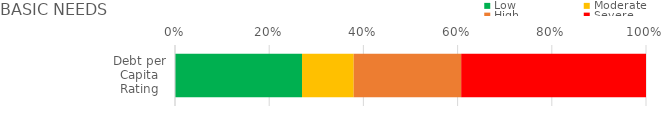
| Category | Low | Moderate | High | Severe |
|---|---|---|---|---|
| Debt per Capita Rating | 0.27 | 0.11 | 0.228 | 0.392 |